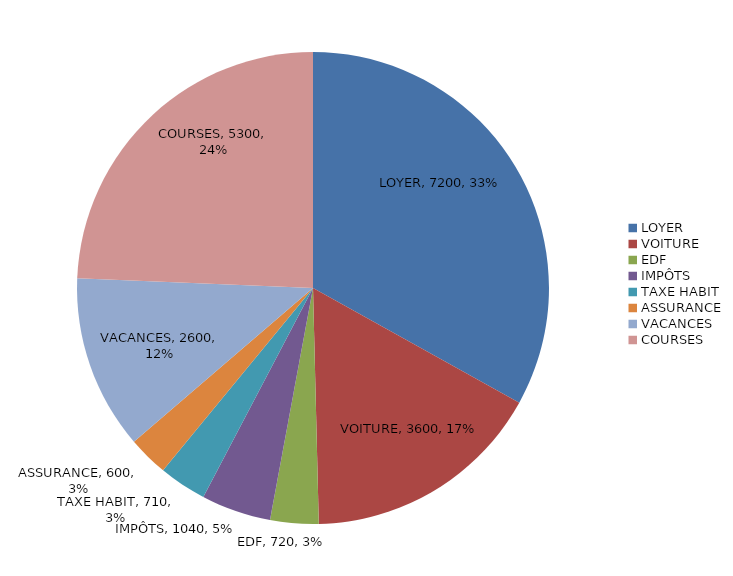
| Category | Series 0 |
|---|---|
| LOYER | 7200 |
| VOITURE | 3600 |
| EDF | 720 |
| IMPÔTS | 1040 |
| TAXE HABIT | 710 |
| ASSURANCE | 600 |
| VACANCES | 2600 |
| COURSES | 5300 |